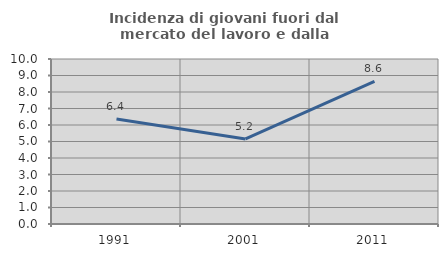
| Category | Incidenza di giovani fuori dal mercato del lavoro e dalla formazione  |
|---|---|
| 1991.0 | 6.369 |
| 2001.0 | 5.155 |
| 2011.0 | 8.642 |